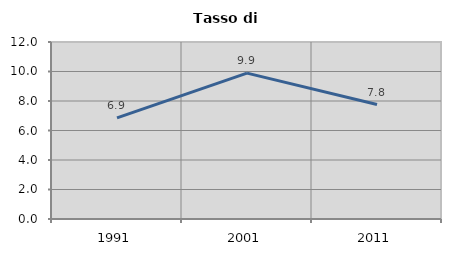
| Category | Tasso di disoccupazione   |
|---|---|
| 1991.0 | 6.859 |
| 2001.0 | 9.892 |
| 2011.0 | 7.759 |